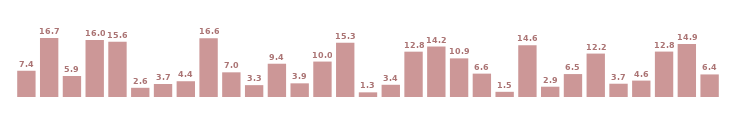
| Category | Average Time On Site |
|---|---|
| 0 | 7.39 |
| 1 | 16.65 |
| 2 | 5.91 |
| 3 | 16.03 |
| 4 | 15.58 |
| 5 | 2.59 |
| 6 | 3.66 |
| 7 | 4.44 |
| 8 | 16.55 |
| 9 | 6.95 |
| 10 | 3.34 |
| 11 | 9.37 |
| 12 | 3.85 |
| 13 | 9.98 |
| 14 | 15.27 |
| 15 | 1.31 |
| 16 | 3.44 |
| 17 | 12.77 |
| 18 | 14.22 |
| 19 | 10.88 |
| 20 | 6.58 |
| 21 | 1.46 |
| 22 | 14.57 |
| 23 | 2.9 |
| 24 | 6.46 |
| 25 | 12.23 |
| 26 | 3.74 |
| 27 | 4.62 |
| 28 | 12.79 |
| 29 | 14.9 |
| 30 | 6.36 |